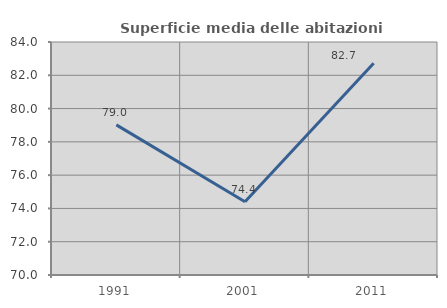
| Category | Superficie media delle abitazioni occupate |
|---|---|
| 1991.0 | 79.018 |
| 2001.0 | 74.399 |
| 2011.0 | 82.727 |